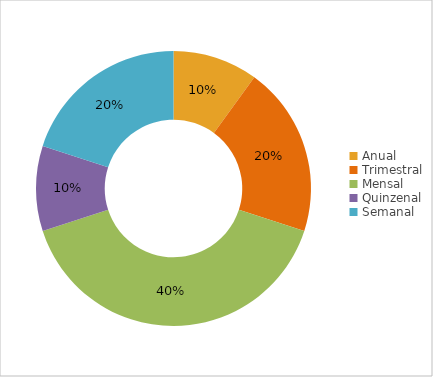
| Category | Series 0 |
|---|---|
| Anual | 1 |
| Trimestral | 2 |
| Mensal | 4 |
| Quinzenal | 1 |
| Semanal | 2 |